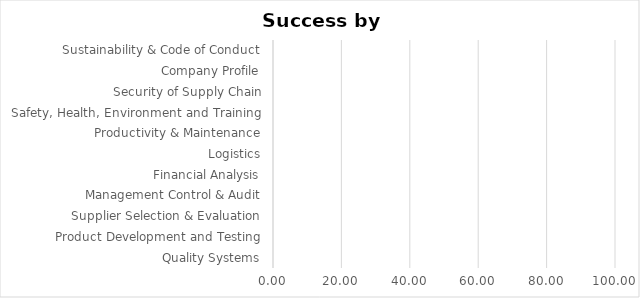
| Category | Series 0 |
|---|---|
| Quality Systems | 0 |
| Product Development and Testing | 0 |
| Supplier Selection & Evaluation | 0 |
| Management Control & Audit | 0 |
| Financial Analysis | 0 |
| Logistics | 0 |
| Productivity & Maintenance | 0 |
| Safety, Health, Environment and Training | 0 |
| Security of Supply Chain | 0 |
| Company Profile | 0 |
| Sustainability & Code of Conduct | 0 |